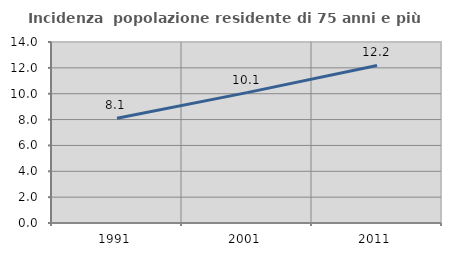
| Category | Incidenza  popolazione residente di 75 anni e più |
|---|---|
| 1991.0 | 8.109 |
| 2001.0 | 10.085 |
| 2011.0 | 12.183 |